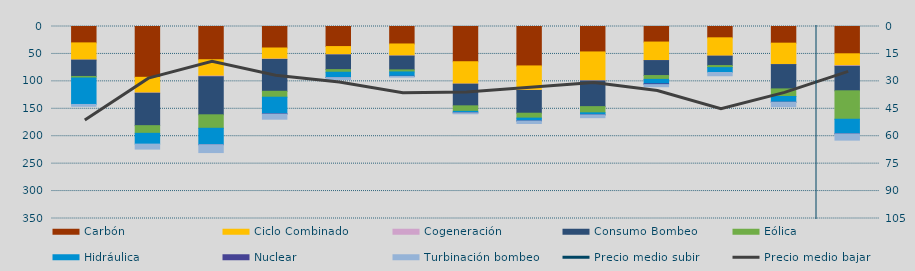
| Category | Carbón | Ciclo Combinado | Cogeneración | Consumo Bombeo | Eólica | Hidráulica | Nuclear | Turbinación bombeo |
|---|---|---|---|---|---|---|---|---|
| E | 29873.4 | 31257.5 | 232.7 | 29718.6 | 2813.5 | 48230.3 | 0 | 3337.1 |
| F | 92635.5 | 28594.2 | 463.1 | 59071.9 | 13978.3 | 19654.8 | 0 | 9063.5 |
| M | 60556.8 | 29853.7 | 1006.6 | 69541.7 | 24572.7 | 29936.2 | 30 | 14315.8 |
| A | 39185.7 | 20218.6 | 667 | 58045.1 | 10784.5 | 30176.3 | 635.3 | 9263.7 |
| M | 36573.1 | 14965.8 | 259.5 | 26811.1 | 4780.9 | 9611.3 | 138 | 3683.8 |
| J | 31856.5 | 21784.2 | 332.6 | 25120.8 | 3742.7 | 7869.8 | 320 | 1244.9 |
| J | 64224.4 | 40730.5 | 223.6 | 39459.7 | 10048.7 | 2606.4 | 130 | 1680.4 |
| A | 71875.8 | 44407.8 | 356.8 | 41443.4 | 8916.4 | 5181.1 | 179.2 | 4517 |
| S | 46377.5 | 52485.1 | 420.2 | 46799.1 | 11262.5 | 3698.4 | 178.3 | 4969.7 |
| O | 28352.7 | 33701.8 | 72.5 | 27285.6 | 6968.9 | 8057.2 | 1524.1 | 3817.1 |
| N | 20637.7 | 33409.3 | 40.8 | 17072.8 | 3847.5 | 8820.4 | 0 | 5932.4 |
| D | 30371.3 | 38818.7 | 239.5 | 44331.3 | 13873.3 | 10280.7 | 108.3 | 8046.3 |
| E | 49749 | 21689 | 1091.7 | 44705.2 | 51833.3 | 26560.6 | 159.6 | 11348.4 |